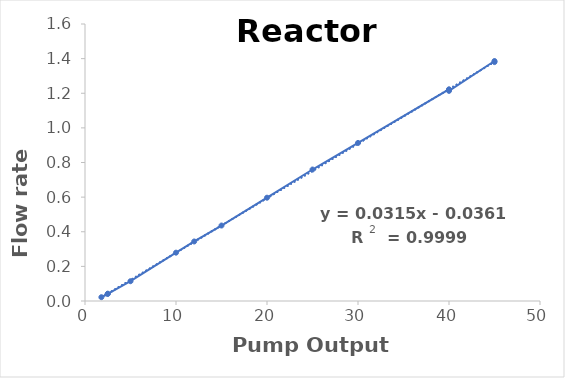
| Category | Flow rate  |
|---|---|
| 45.0 | 1.38 |
| 45.0 | 1.386 |
| 40.0 | 1.214 |
| 40.0 | 1.223 |
| 40.0 | 1.22 |
| 30.0 | 0.913 |
| 25.0 | 0.759 |
| 20.0 | 0.597 |
| 15.0 | 0.436 |
| 12.0 | 0.344 |
| 10.0 | 0.279 |
| 5.0 | 0.114 |
| 2.5 | 0.041 |
| 2.5 | 0.042 |
| 1.8 | 0.022 |